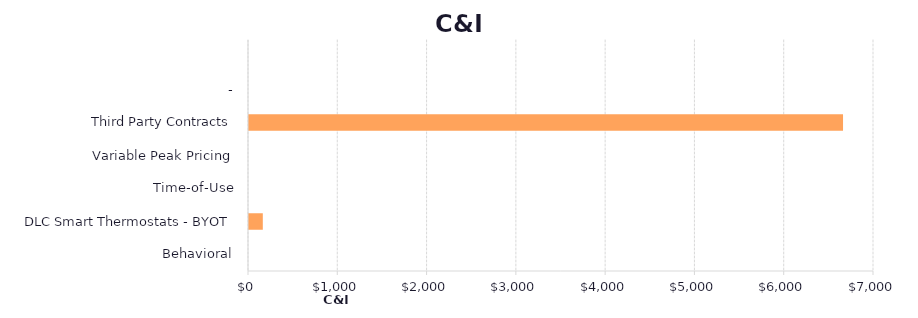
| Category | Series 1 |
|---|---|
| Behavioral | 0 |
| DLC Smart Thermostats - BYOT | 154.662 |
| Time-of-Use | 0 |
| Variable Peak Pricing | 0 |
| Third Party Contracts | 6653.166 |
| - | 0 |